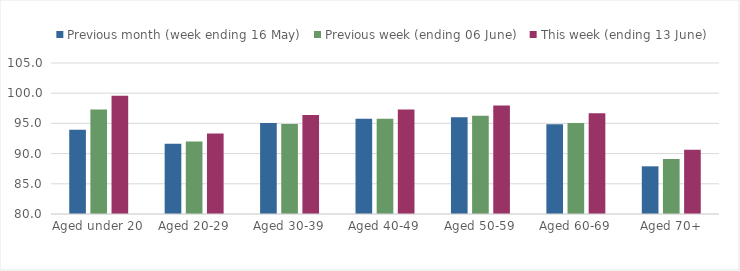
| Category | Previous month (week ending 16 May) | Previous week (ending 06 June) | This week (ending 13 June) |
|---|---|---|---|
| Aged under 20 | 93.961 | 97.314 | 99.578 |
| Aged 20-29 | 91.614 | 92.012 | 93.337 |
| Aged 30-39 | 95.072 | 94.888 | 96.391 |
| Aged 40-49 | 95.77 | 95.782 | 97.305 |
| Aged 50-59 | 96.028 | 96.287 | 97.955 |
| Aged 60-69 | 94.865 | 95.065 | 96.673 |
| Aged 70+ | 87.894 | 89.106 | 90.631 |